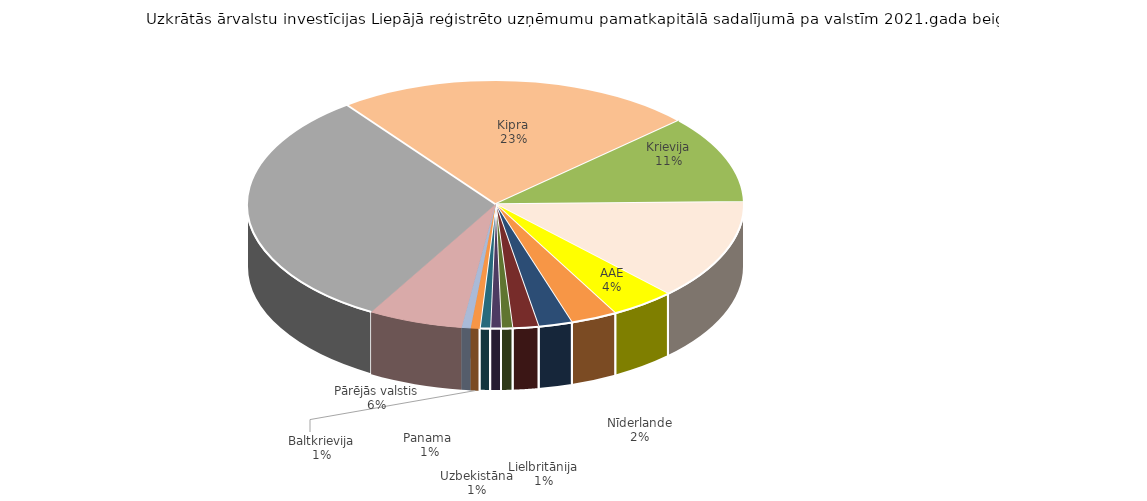
| Category | tūkst. EUR | Series 1 | Series 2 | Series 3 | Series 4 | Series 5 | Series 6 | Series 7 |
|---|---|---|---|---|---|---|---|---|
| Zviedrija | 43107.4 | 31.445 |  |  |  |  |  |  |
| Kipra | 32150 | 23.452 |  |  |  |  |  |  |
| Krievija | 15728.7 | 11.473 |  |  |  |  |  |  |
| Dānija | 17947.4 | 13.092 |  |  |  |  |  |  |
| AAE | 5765.765 | 4.206 |  |  |  |  |  |  |
| Lietuva | 4152.9 | 4.206 |  |  |  |  |  |  |
| Nīderlande | 3012.3 | 2.197 |  |  |  |  |  |  |
| Vācija | 2310.8 | 1.686 |  |  |  |  |  |  |
| Lielbritānija | 1006.6 | 0.734 |  |  |  |  |  |  |
| Uzbekistāna | 947.3 | 0.691 |  |  |  |  |  |  |
| Panama  | 924.866 | 0.675 |  |  |  |  |  |  |
| Baltkrievija | 783.4 | 0.571 |  |  |  |  |  |  |
| Austrija | 810.6 | 0.591 |  |  |  |  |  |  |
| Pārējās valstis | 8439.47 | 6.156 |  |  |  |  |  |  |